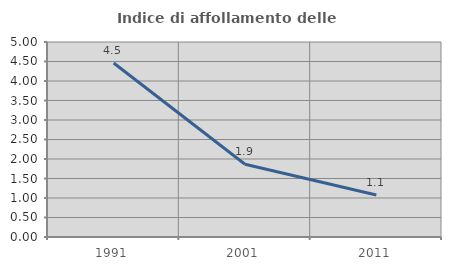
| Category | Indice di affollamento delle abitazioni  |
|---|---|
| 1991.0 | 4.46 |
| 2001.0 | 1.866 |
| 2011.0 | 1.077 |